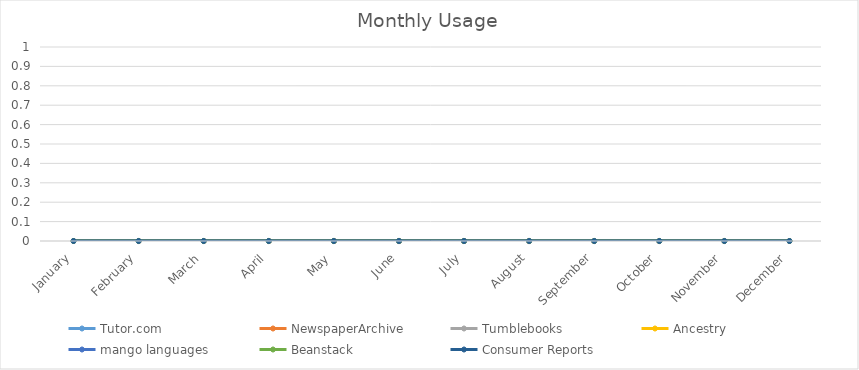
| Category | Tutor.com | NewspaperArchive | Tumblebooks | Ancestry | mango languages | Beanstack | Consumer Reports |
|---|---|---|---|---|---|---|---|
| 0 | 0 | 0 | 0 | 0 | 0 | 0 | 0 |
| 1 | 0 | 0 | 0 | 0 | 0 | 0 | 0 |
| 2 | 0 | 0 | 0 | 0 | 0 | 0 | 0 |
| 3 | 0 | 0 | 0 | 0 | 0 | 0 | 0 |
| 4 | 0 | 0 | 0 | 0 | 0 | 0 | 0 |
| 5 | 0 | 0 | 0 | 0 | 0 | 0 | 0 |
| 6 | 0 | 0 | 0 | 0 | 0 | 0 | 0 |
| 7 | 0 | 0 | 0 | 0 | 0 | 0 | 0 |
| 8 | 0 | 0 | 0 | 0 | 0 | 0 | 0 |
| 9 | 0 | 0 | 0 | 0 | 0 | 0 | 0 |
| 10 | 0 | 0 | 0 | 0 | 0 | 0 | 0 |
| 11 | 0 | 0 | 0 | 0 | 0 | 0 | 0 |